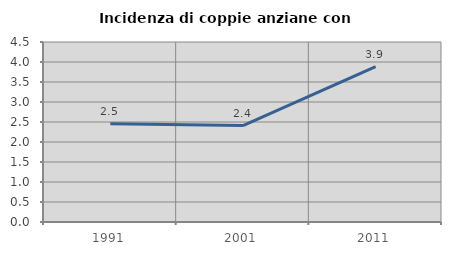
| Category | Incidenza di coppie anziane con figli |
|---|---|
| 1991.0 | 2.455 |
| 2001.0 | 2.411 |
| 2011.0 | 3.883 |